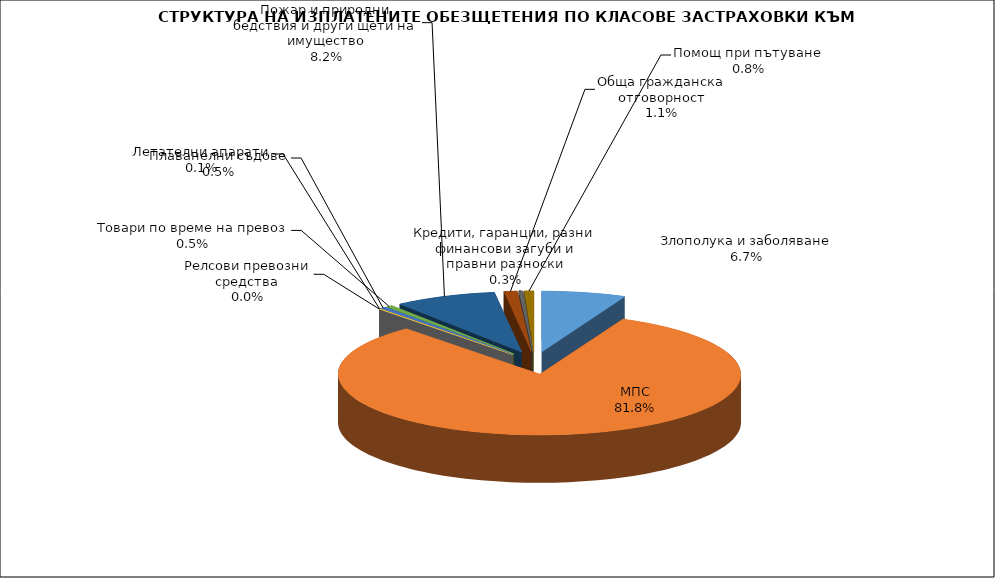
| Category | Злополука и заболяване |
|---|---|
| Злополука и заболяване | 0.067 |
| МПС | 0.818 |
| Релсови превозни средства | 0 |
| Летателни апарати | 0.001 |
| Плаванелни съдове | 0.005 |
| Товари по време на превоз | 0.005 |
| Пожар и природни бедствия и други щети на имущество | 0.082 |
| Обща гражданска отговорност | 0.011 |
| Кредити, гаранции, разни финансови загуби и правни разноски | 0.003 |
| Помощ при пътуване | 0.008 |